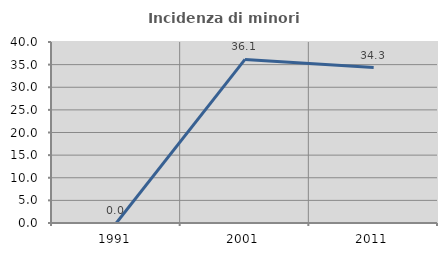
| Category | Incidenza di minori stranieri |
|---|---|
| 1991.0 | 0 |
| 2001.0 | 36.145 |
| 2011.0 | 34.343 |